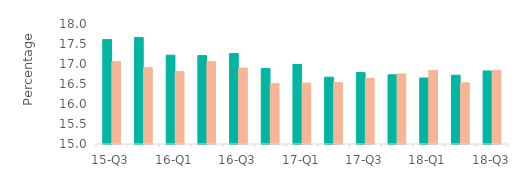
| Category | First-time
buyers | Home movers |
|---|---|---|
| 15-Q3 | 17.61 | 17.06 |
| 15-Q4 | 17.66 | 16.91 |
| 16-Q1 | 17.22 | 16.81 |
| 16-Q2 | 17.21 | 17.06 |
| 16-Q3 | 17.26 | 16.9 |
| 16-Q4 | 16.885 | 16.51 |
| 17-Q1 | 16.99 | 16.52 |
| 17-Q2 | 16.67 | 16.54 |
| 17-Q3 | 16.79 | 16.64 |
| 17-Q4 | 16.73 | 16.75 |
| 18-Q1 | 16.65 | 16.84 |
| 18-Q2 | 16.72 | 16.53 |
| 18-Q3 | 16.825 | 16.84 |